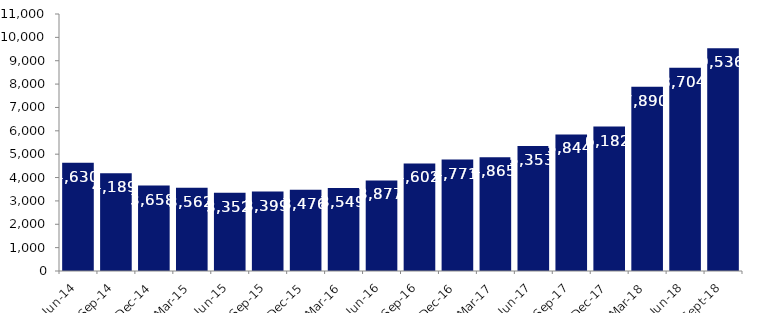
| Category | Series 0 |
|---|---|
| Jun-14 | 4630 |
| Sep-14 | 4189 |
| Dec-14 | 3658 |
| Mar-15 | 3562 |
| Jun-15 | 3352 |
| Sep-15 | 3399 |
| Dec-15 | 3476 |
| Mar-16 | 3549 |
| Jun-16 | 3877 |
| Sep-16 | 4602 |
| Dec-16 | 4771 |
| Mar-17 | 4865 |
| Jun-17 | 5353 |
| Sep-17 | 5844 |
| Dec-17 | 6182 |
| Mar-18 | 7890 |
| Jun-18 | 8704 |
| Sep-18 | 9536 |